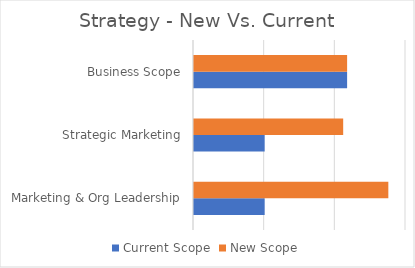
| Category | Current Scope | New Scope |
|---|---|---|
| Marketing & Org Leadership | 1 | 2.75 |
| Strategic Marketing | 1 | 2.111 |
| Business Scope | 2.167 | 2.167 |